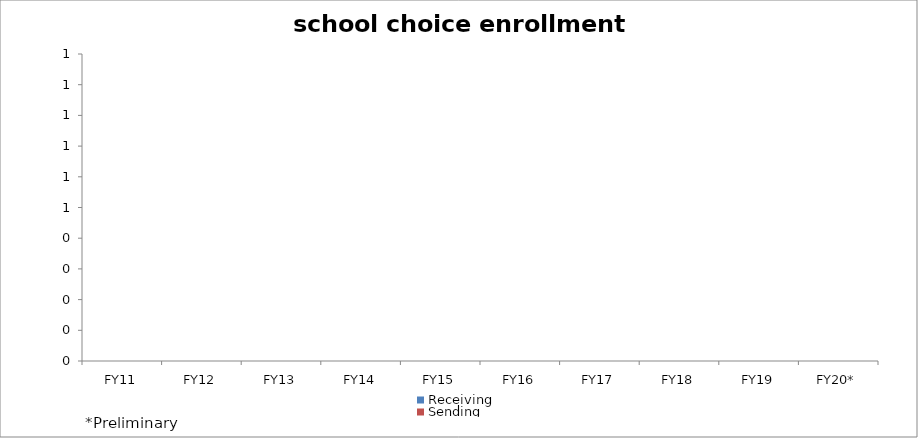
| Category | Receiving | Sending |
|---|---|---|
| FY11 | 0 | 0 |
| FY12 | 0 | 0 |
| FY13 | 0 | 0 |
| FY14 | 0 | 0 |
| FY15 | 0 | 0 |
| FY16 | 0 | 0 |
| FY17 | 0 | 0 |
| FY18 | 0 | 0 |
| FY19 | 0 | 0 |
| FY20* | 0 | 0 |